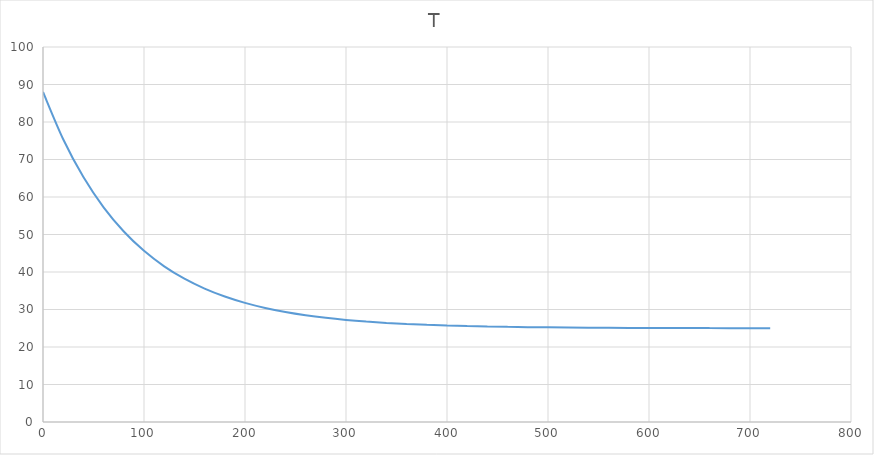
| Category | T |
|---|---|
| 0.0 | 88 |
| 20.0 | 75.4 |
| 40.0 | 65.32 |
| 60.0 | 57.256 |
| 80.0 | 50.805 |
| 100.0 | 45.644 |
| 120.0 | 41.515 |
| 140.0 | 38.212 |
| 160.0 | 35.57 |
| 180.0 | 33.456 |
| 200.0 | 31.765 |
| 220.0 | 30.412 |
| 240.0 | 29.329 |
| 260.0 | 28.463 |
| 280.0 | 27.771 |
| 300.0 | 27.217 |
| 320.0 | 26.773 |
| 340.0 | 26.419 |
| 360.0 | 26.135 |
| 380.0 | 25.908 |
| 400.0 | 25.726 |
| 420.0 | 25.581 |
| 440.0 | 25.465 |
| 460.0 | 25.372 |
| 480.0 | 25.298 |
| 500.0 | 25.238 |
| 520.0 | 25.19 |
| 540.0 | 25.152 |
| 560.0 | 25.122 |
| 580.0 | 25.097 |
| 600.0 | 25.078 |
| 620.0 | 25.062 |
| 640.0 | 25.05 |
| 660.0 | 25.04 |
| 680.0 | 25.032 |
| 700.0 | 25.026 |
| 720.0 | 25.02 |